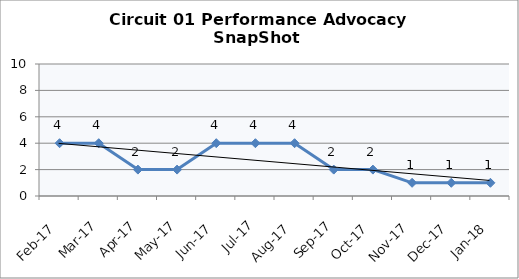
| Category | Circuit 01 |
|---|---|
| Feb-17 | 4 |
| Mar-17 | 4 |
| Apr-17 | 2 |
| May-17 | 2 |
| Jun-17 | 4 |
| Jul-17 | 4 |
| Aug-17 | 4 |
| Sep-17 | 2 |
| Oct-17 | 2 |
| Nov-17 | 1 |
| Dec-17 | 1 |
| Jan-18 | 1 |